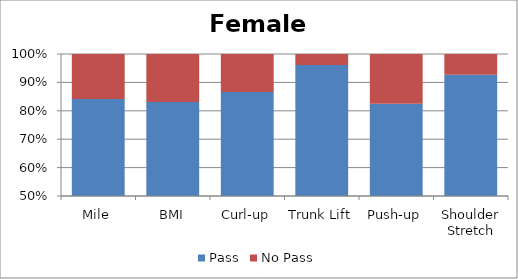
| Category | Pass | No Pass |
|---|---|---|
| Mile | 600 | 113 |
| BMI | 550 | 112 |
| Curl-up | 699 | 108 |
| Trunk Lift | 792 | 32 |
| Push-up | 631 | 134 |
| Shoulder Stretch | 773 | 61 |